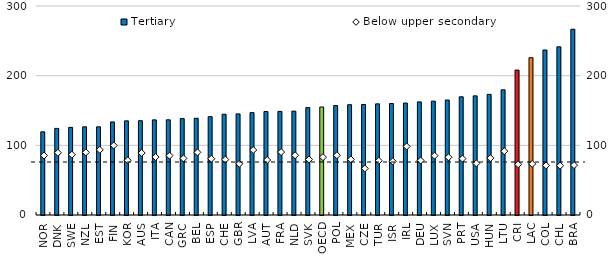
| Category | Tertiary |
|---|---|
| NOR | 119.404 |
| DNK | 124.304 |
| SWE | 125.761 |
| NZL | 126.556 |
| EST | 126.577 |
| FIN | 133.598 |
| KOR | 135.14 |
| AUS | 135.334 |
| ITA | 136.537 |
| CAN | 136.645 |
| GRC | 138.42 |
| BEL | 138.843 |
| ESP | 141.154 |
| CHE | 144.654 |
| GBR | 145.117 |
| LVA | 146.973 |
| AUT | 148.524 |
| FRA | 148.694 |
| NLD | 149.077 |
| SVK | 154.159 |
| OECD | 155.012 |
| POL | 157.095 |
| MEX | 158.305 |
| CZE | 158.628 |
| TUR | 159.552 |
| ISR | 160.025 |
| IRL | 160.656 |
| DEU | 162.364 |
| LUX | 163.455 |
| SVN | 165.039 |
| PRT | 169.679 |
| USA | 171.008 |
| HUN | 173.213 |
| LTU | 179.689 |
| CRI | 208.036 |
| LAC | 225.777 |
| COL | 236.808 |
| CHL | 241.39 |
| BRA | 266.607 |